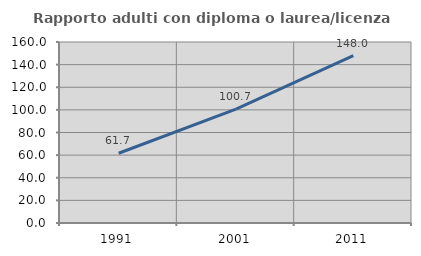
| Category | Rapporto adulti con diploma o laurea/licenza media  |
|---|---|
| 1991.0 | 61.682 |
| 2001.0 | 100.73 |
| 2011.0 | 148 |